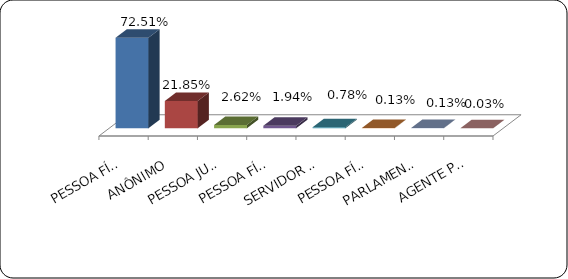
| Category | Series 0 |
|---|---|
|      PESSOA FÍSICA | 0.725 |
|      ANÔNIMO | 0.219 |
|      PESSOA JURÍDICA | 0.026 |
|      PESSOA FÍSICA ACIMA DE 60 ANOS | 0.019 |
|      SERVIDOR PÚBLICO | 0.008 |
|      PESSOA FÍSICA ACIMA DE 80 ANOS | 0.001 |
|      PARLAMENTAR | 0.001 |
|      AGENTE POLÍTICO | 0 |